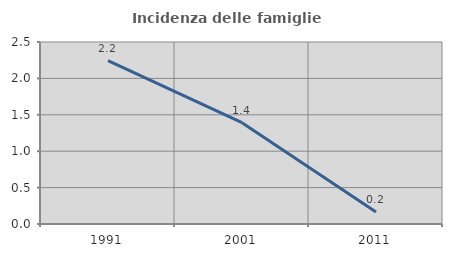
| Category | Incidenza delle famiglie numerose |
|---|---|
| 1991.0 | 2.244 |
| 2001.0 | 1.391 |
| 2011.0 | 0.164 |